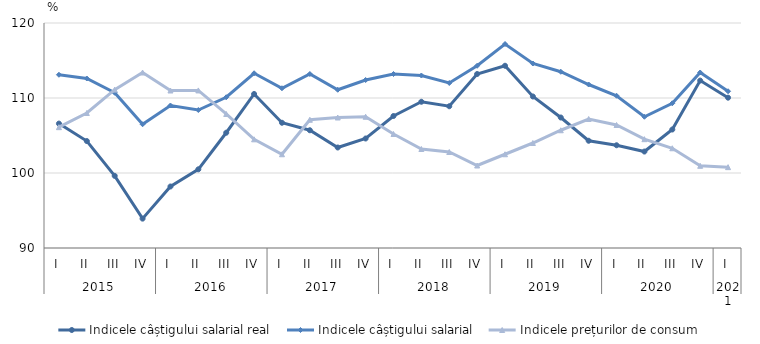
| Category | Indicele câștigului salarial real | Indicele câștigului salarial | Indicele prețurilor de consum |
|---|---|---|---|
| 0 | 106.588 | 113.1 | 106.11 |
| 1 | 104.259 | 112.6 | 108 |
| 2 | 99.622 | 110.7 | 111.12 |
| 3 | 93.915 | 106.5 | 113.4 |
| 4 | 98.2 | 109 | 111 |
| 5 | 100.491 | 108.4 | 111.01 |
| 6 | 105.369 | 110.1 | 107.87 |
| 7 | 110.537 | 113.3 | 104.49 |
| 8 | 106.7 | 111.3 | 102.5 |
| 9 | 105.7 | 113.2 | 107.1 |
| 10 | 103.4 | 111.1 | 107.4 |
| 11 | 104.6 | 112.4 | 107.5 |
| 12 | 107.6 | 113.2 | 105.2 |
| 13 | 109.5 | 113 | 103.2 |
| 14 | 108.9 | 112 | 102.8 |
| 15 | 113.2 | 114.3 | 101 |
| 16 | 114.3 | 117.2 | 102.5 |
| 17 | 110.2 | 114.6 | 104 |
| 18 | 107.4 | 113.5 | 105.7 |
| 19 | 104.3 | 111.8 | 107.2 |
| 20 | 103.7 | 110.3 | 106.4 |
| 21 | 102.861 | 107.5 | 104.51 |
| 22 | 105.8 | 109.3 | 103.3 |
| 23 | 112.322 | 113.4 | 100.96 |
| 24 | 110.042 | 110.9 | 100.78 |